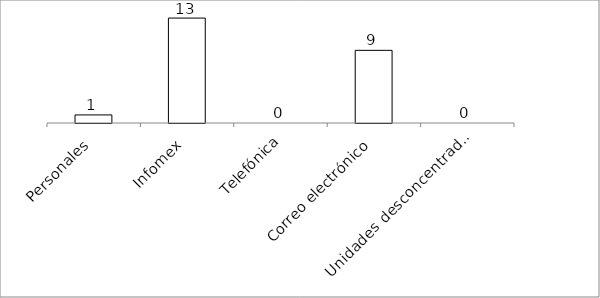
| Category | Series 0 |
|---|---|
| Personales | 1 |
| Infomex | 13 |
| Telefónica | 0 |
| Correo electrónico | 9 |
| Unidades desconcentradas | 0 |